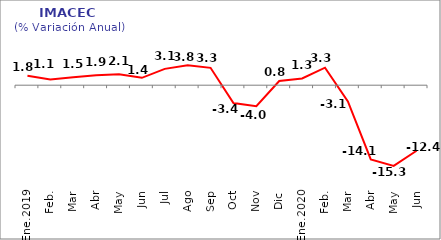
| Category | Series 0 |
|---|---|
| Ene.2019 | 1.8 |
| Feb. | 1.1 |
| Mar | 1.5 |
| Abr | 1.9 |
| May | 2.1 |
| Jun | 1.4 |
| Jul | 3.1 |
| Ago | 3.8 |
| Sep | 3.3 |
| Oct | -3.4 |
| Nov | -4 |
| Dic | 0.8 |
| Ene.2020 | 1.285 |
| Feb. | 3.328 |
| Mar | -3.081 |
| Abr | -14.097 |
| May | -15.319 |
| Jun | -12.442 |